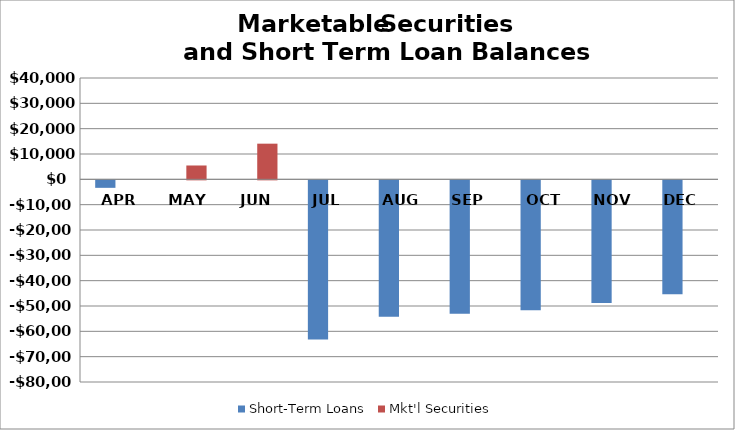
| Category | Short-Term Loans | Mkt'l Securities |
|---|---|---|
| APR | -2962.5 | 0 |
| MAY | 0 | 5465 |
| JUN | 0 | 14077.5 |
| JUL | -62810 | 0 |
| AUG | -53897.5 | 0 |
| SEP | -52697.5 | 0 |
| OCT | -51305 | 0 |
| NOV | -48402.5 | 0 |
| DEC | -44941.25 | 0 |